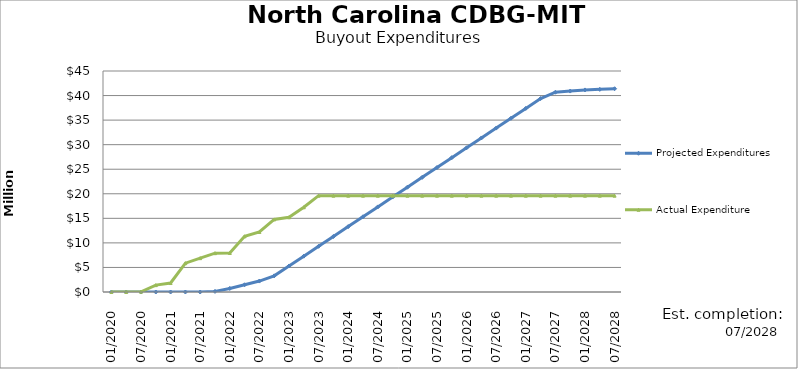
| Category | Projected Expenditures | Actual Expenditure |
|---|---|---|
| 01/2020 | 0 | 0 |
| 04/2020 | 0 | 0 |
| 07/2020 | 0 | 51196.5 |
| 10/2020 | 0 | 1396995.41 |
| 01/2021 | 0 | 1828831.36 |
| 04/2021 | 0 | 5869022.93 |
| 07/2021 | 0 | 6889035.93 |
| 10/2021 | 125000 | 7903076.08 |
| 01/2022 | 725000 | 7944165.05 |
| 04/2022 | 1475000 | 11338167.15 |
| 07/2022 | 2225000 | 12222903.41 |
| 10/2022 | 3285000 | 14775198.96 |
| 01/2023 | 5290848.136 | 15211645.54 |
| 04/2023 | 7296696.272 | 17252233.6 |
| 07/2023 | 9302544.409 | 19618576.57 |
| 10/2023 | 11308392.545 | 19618576.57 |
| 01/2024 | 13314240.681 | 19618576.57 |
| 04/2024 | 15320088.817 | 19618576.57 |
| 07/2024 | 17325936.953 | 19618576.57 |
| 10/2024 | 19331785.09 | 19618576.57 |
| 01/2025 | 21337633.226 | 19618576.57 |
| 04/2025 | 23343481.362 | 19618576.57 |
| 07/2025 | 25349329.498 | 19618576.57 |
| 10/2025 | 27355177.634 | 19618576.57 |
| 01/2026 | 29361025.77 | 19618576.57 |
| 04/2026 | 31366873.907 | 19618576.57 |
| 07/2026 | 33372722.043 | 19618576.57 |
| 10/2026 | 35378570.179 | 19618576.57 |
| 01/2027 | 37384418.315 | 19618576.57 |
| 04/2027 | 39390266.451 | 19618576.57 |
| 07/2027 | 40680959.451 | 19618576.57 |
| 10/2027 | 40913046.121 | 19618576.57 |
| 01/2028 | 41145132.791 | 19618576.57 |
| 04/2028 | 41261175.791 | 19618576.57 |
| 07/2028 | 41391773.126 | 19618576.57 |